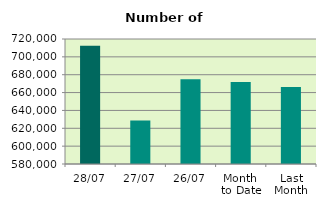
| Category | Series 0 |
|---|---|
| 28/07 | 712444 |
| 27/07 | 628852 |
| 26/07 | 675034 |
| Month 
to Date | 671858.5 |
| Last
Month | 666251.273 |